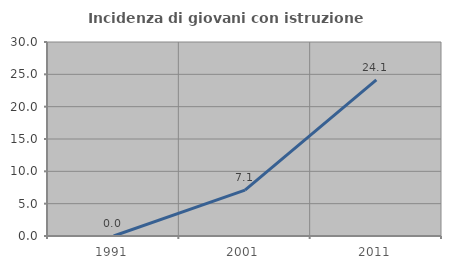
| Category | Incidenza di giovani con istruzione universitaria |
|---|---|
| 1991.0 | 0 |
| 2001.0 | 7.107 |
| 2011.0 | 24.138 |